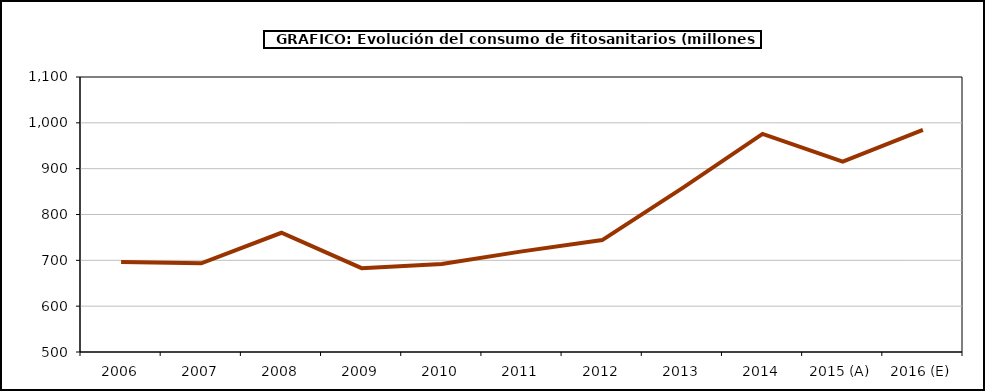
| Category | fitosanitarios |
|---|---|
| 2006 | 696.177 |
| 2007 | 693.603 |
| 2008 | 760.166 |
| 2009 | 682.842 |
| 2010 | 692.238 |
| 2011 | 719.583 |
| 2012 | 744.231 |
| 2013 | 857.443 |
| 2014 | 975.802 |
| 2015 (A) | 915.378 |
| 2016 (E) | 984.804 |